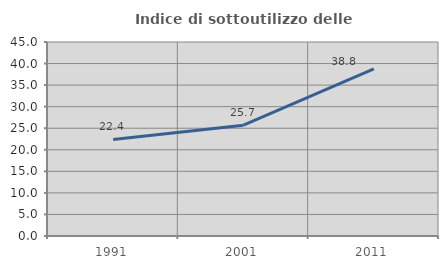
| Category | Indice di sottoutilizzo delle abitazioni  |
|---|---|
| 1991.0 | 22.403 |
| 2001.0 | 25.696 |
| 2011.0 | 38.791 |